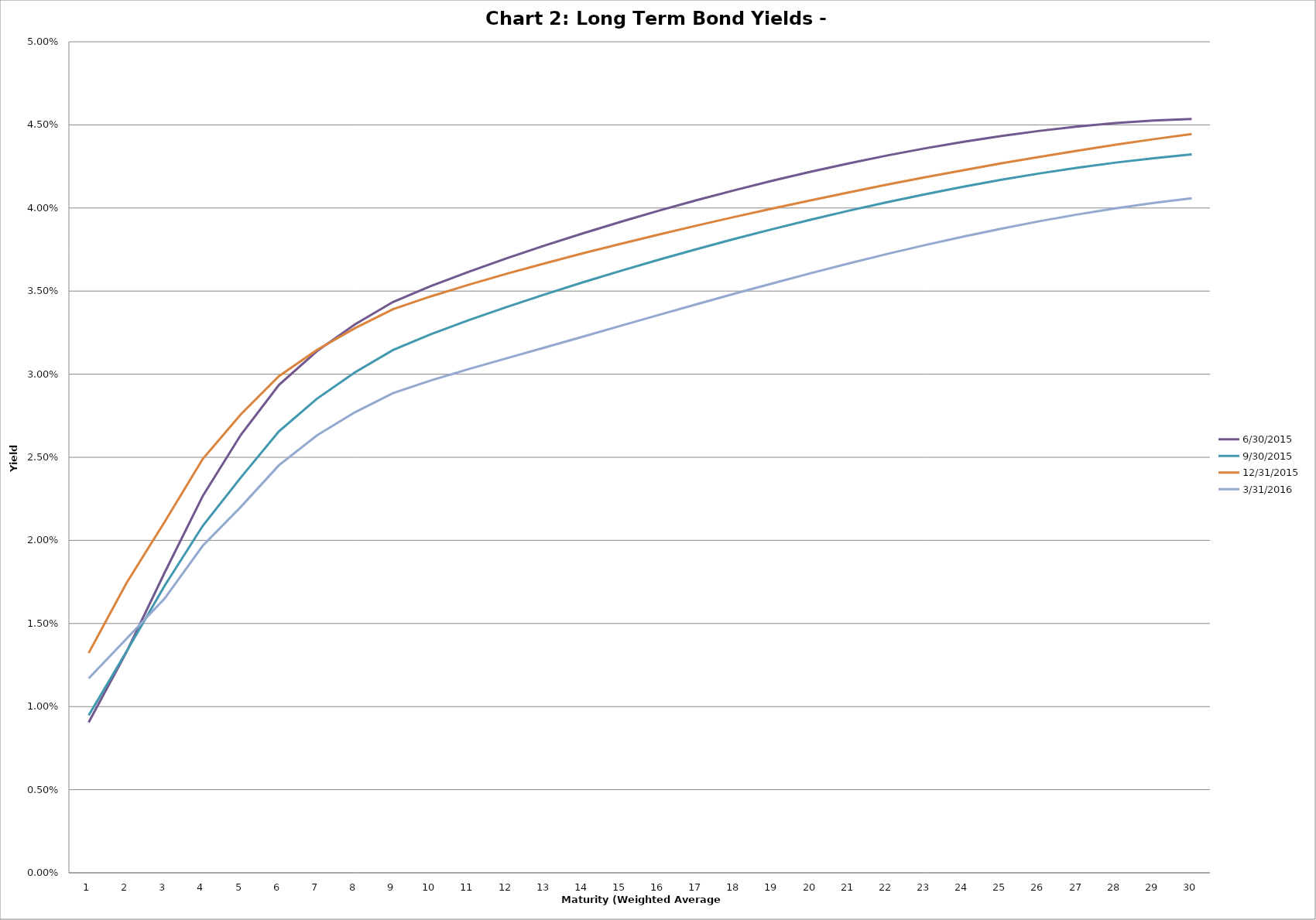
| Category | 6/30/2015 | 9/30/2015 | 12/31/2015 | 3/31/2016 |
|---|---|---|---|---|
| 0 | 0.009 | 0.009 | 0.013 | 0.012 |
| 1 | 0.013 | 0.013 | 0.017 | 0.014 |
| 2 | 0.018 | 0.017 | 0.021 | 0.017 |
| 3 | 0.023 | 0.021 | 0.025 | 0.02 |
| 4 | 0.026 | 0.024 | 0.028 | 0.022 |
| 5 | 0.029 | 0.027 | 0.03 | 0.025 |
| 6 | 0.031 | 0.029 | 0.031 | 0.026 |
| 7 | 0.033 | 0.03 | 0.033 | 0.028 |
| 8 | 0.034 | 0.031 | 0.034 | 0.029 |
| 9 | 0.035 | 0.032 | 0.035 | 0.03 |
| 10 | 0.036 | 0.033 | 0.035 | 0.03 |
| 11 | 0.037 | 0.034 | 0.036 | 0.031 |
| 12 | 0.038 | 0.035 | 0.037 | 0.032 |
| 13 | 0.038 | 0.036 | 0.037 | 0.032 |
| 14 | 0.039 | 0.036 | 0.038 | 0.033 |
| 15 | 0.04 | 0.037 | 0.038 | 0.034 |
| 16 | 0.04 | 0.038 | 0.039 | 0.034 |
| 17 | 0.041 | 0.038 | 0.039 | 0.035 |
| 18 | 0.042 | 0.039 | 0.04 | 0.035 |
| 19 | 0.042 | 0.039 | 0.04 | 0.036 |
| 20 | 0.043 | 0.04 | 0.041 | 0.037 |
| 21 | 0.043 | 0.04 | 0.041 | 0.037 |
| 22 | 0.044 | 0.041 | 0.042 | 0.038 |
| 23 | 0.044 | 0.041 | 0.042 | 0.038 |
| 24 | 0.044 | 0.042 | 0.043 | 0.039 |
| 25 | 0.045 | 0.042 | 0.043 | 0.039 |
| 26 | 0.045 | 0.042 | 0.043 | 0.04 |
| 27 | 0.045 | 0.043 | 0.044 | 0.04 |
| 28 | 0.045 | 0.043 | 0.044 | 0.04 |
| 29 | 0.045 | 0.043 | 0.044 | 0.041 |